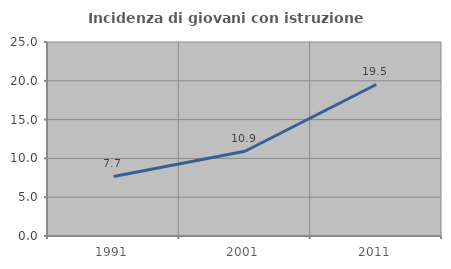
| Category | Incidenza di giovani con istruzione universitaria |
|---|---|
| 1991.0 | 7.675 |
| 2001.0 | 10.923 |
| 2011.0 | 19.527 |